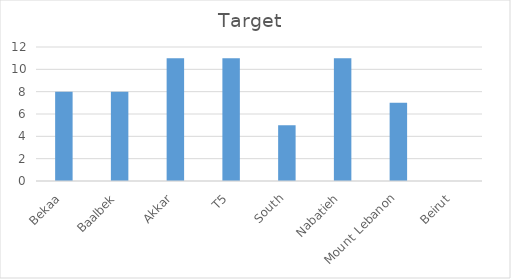
| Category | Series 0 |
|---|---|
| Bekaa | 8 |
| Baalbek | 8 |
| Akkar | 11 |
| T5 | 11 |
| South | 5 |
| Nabatieh | 11 |
| Mount Lebanon | 7 |
| Beirut | 0 |